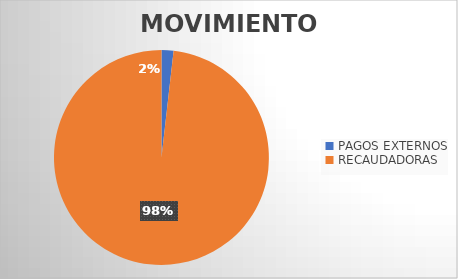
| Category | MOVIMIENTOS |
|---|---|
| PAGOS EXTERNOS | 341 |
| RECAUDADORAS | 18592 |